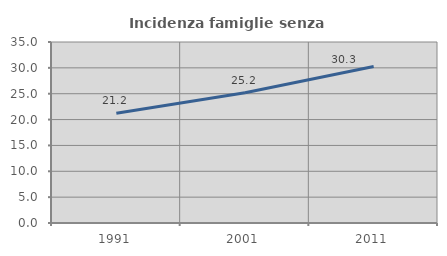
| Category | Incidenza famiglie senza nuclei |
|---|---|
| 1991.0 | 21.212 |
| 2001.0 | 25.174 |
| 2011.0 | 30.269 |